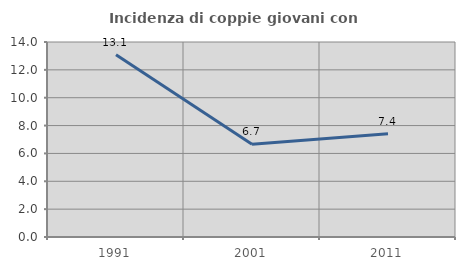
| Category | Incidenza di coppie giovani con figli |
|---|---|
| 1991.0 | 13.076 |
| 2001.0 | 6.658 |
| 2011.0 | 7.416 |